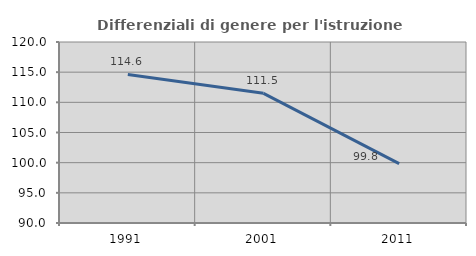
| Category | Differenziali di genere per l'istruzione superiore |
|---|---|
| 1991.0 | 114.627 |
| 2001.0 | 111.49 |
| 2011.0 | 99.848 |